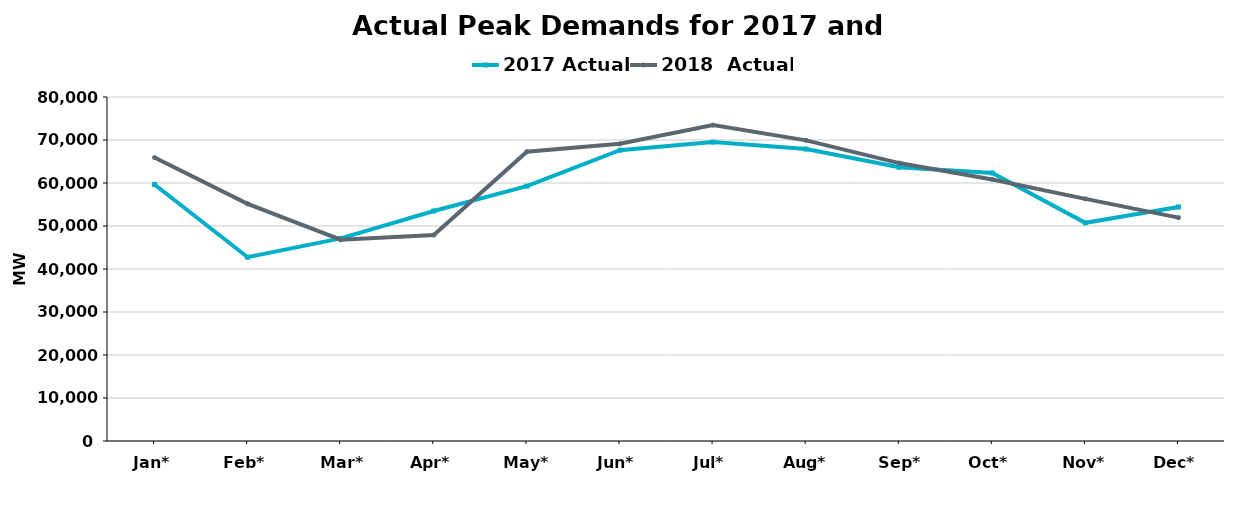
| Category | 2017 Actual | 2018  Actual |
|---|---|---|
| Jan* | 59650 | 65915 |
| Feb* | 42743 | 55163 |
| Mar* | 47116 | 46812 |
| Apr* | 53486 | 47899 |
| May* | 59264 | 67265 |
| Jun* | 67633 | 69123 |
| Jul* | 69512 | 73473 |
| Aug* | 67889 | 69919 |
| Sep* | 63649 | 64630 |
| Oct* | 62333 | 60827 |
| Nov* | 50735 | 56317 |
| Dec* | 54432 | 51956 |